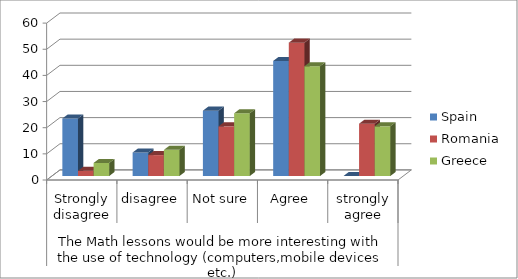
| Category | Spain | Romania | Greece |
|---|---|---|---|
| 0 | 22 | 2 | 5 |
| 1 | 9 | 8 | 10 |
| 2 | 25 | 19 | 24 |
| 3 | 44 | 51 | 42 |
| 4 | 0 | 20 | 19 |